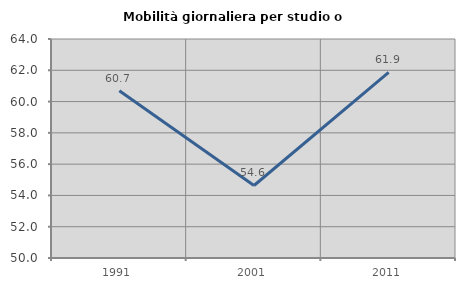
| Category | Mobilità giornaliera per studio o lavoro |
|---|---|
| 1991.0 | 60.69 |
| 2001.0 | 54.636 |
| 2011.0 | 61.873 |